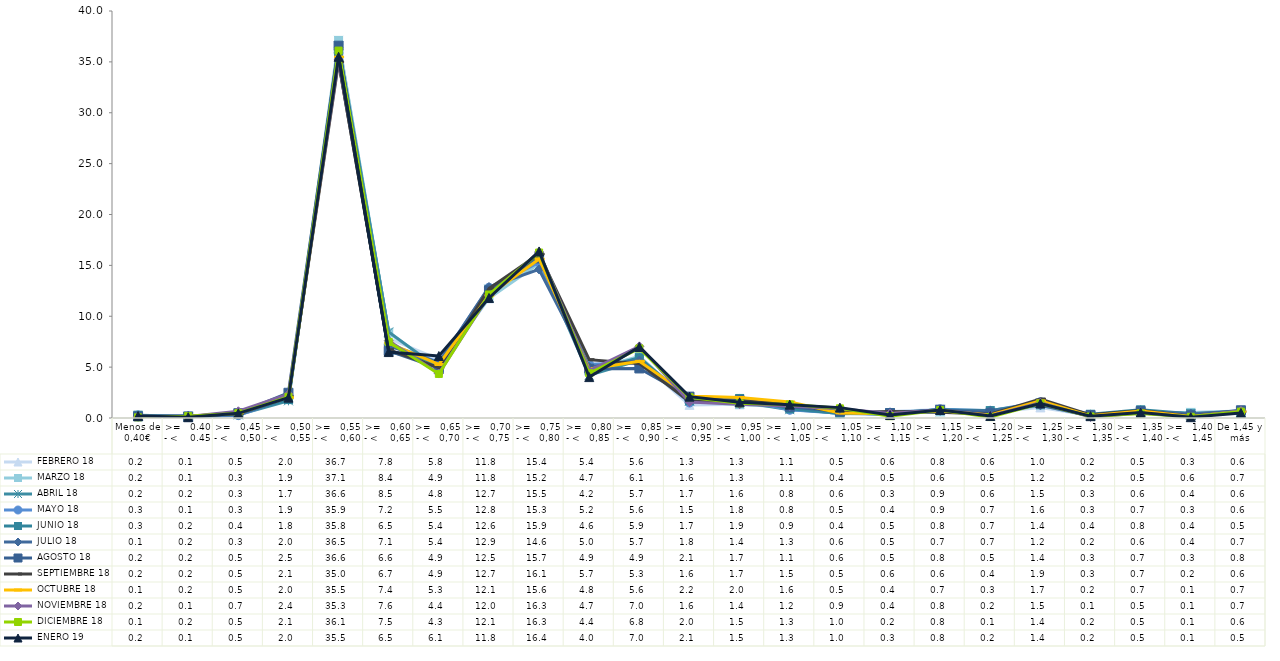
| Category |  FEBRERO 18 |  MARZO 18 |  ABRIL 18 |  MAYO 18 |  JUNIO 18 |  JULIO 18 |  AGOSTO 18 |  SEPTIEMBRE 18 |  OCTUBRE 18 |  NOVIEMBRE 18 |  DICIEMBRE 18 |  ENERO 19 |
|---|---|---|---|---|---|---|---|---|---|---|---|---|
| Menos de 0,40€ | 0.23 | 0.24 | 0.2 | 0.25 | 0.28 | 0.12 | 0.15 | 0.17 | 0.08 | 0.16 | 0.07 | 0.2 |
| >=   0.40 - <    0.45 | 0.08 | 0.1 | 0.16 | 0.11 | 0.17 | 0.22 | 0.15 | 0.15 | 0.15 | 0.14 | 0.18 | 0.08 |
| >=   0,45 - <    0,50 | 0.47 | 0.33 | 0.32 | 0.28 | 0.4 | 0.33 | 0.47 | 0.45 | 0.53 | 0.66 | 0.47 | 0.46 |
| >=   0,50 - <    0,55 | 1.95 | 1.9 | 1.69 | 1.94 | 1.81 | 2.02 | 2.48 | 2.09 | 2.02 | 2.35 | 2.08 | 2 |
| >=   0,55 - <    0,60 | 36.65 | 37.11 | 36.55 | 35.9 | 35.81 | 36.45 | 36.59 | 34.99 | 35.48 | 35.27 | 36.11 | 35.5 |
| >=   0,60 - <    0,65 | 7.82 | 8.37 | 8.46 | 7.24 | 6.54 | 7.09 | 6.6 | 6.71 | 7.36 | 7.6 | 7.48 | 6.48 |
| >=   0,65 - <   0,70 | 5.77 | 4.94 | 4.82 | 5.48 | 5.37 | 5.43 | 4.89 | 4.94 | 5.26 | 4.37 | 4.33 | 6.09 |
| >=   0,70 - <   0,75 | 11.76 | 11.77 | 12.66 | 12.8 | 12.63 | 12.87 | 12.53 | 12.72 | 12.06 | 12.03 | 12.14 | 11.8 |
| >=   0,75 - <   0,80 | 15.39 | 15.19 | 15.48 | 15.29 | 15.89 | 14.6 | 15.68 | 16.11 | 15.63 | 16.31 | 16.26 | 16.37 |
| >=   0,80 - <   0,85 | 5.36 | 4.73 | 4.21 | 5.24 | 4.61 | 5.02 | 4.85 | 5.73 | 4.81 | 4.65 | 4.4 | 4.02 |
| >=   0,85 - <   0,90 | 5.62 | 6.06 | 5.68 | 5.56 | 5.93 | 5.66 | 4.87 | 5.34 | 5.57 | 7.04 | 6.84 | 6.98 |
| >=   0,90 - <    0,95 | 1.29 | 1.62 | 1.67 | 1.52 | 1.71 | 1.79 | 2.1 | 1.62 | 2.15 | 1.56 | 2.04 | 2.1 |
| >=   0,95 - <   1,00 | 1.34 | 1.33 | 1.6 | 1.79 | 1.92 | 1.43 | 1.74 | 1.68 | 2.01 | 1.35 | 1.45 | 1.54 |
| >=   1,00 - <   1,05 | 1.06 | 1.09 | 0.82 | 0.81 | 0.91 | 1.3 | 1.1 | 1.47 | 1.58 | 1.18 | 1.33 | 1.31 |
| >=   1,05 - <    1,10 | 0.46 | 0.4 | 0.55 | 0.46 | 0.44 | 0.63 | 0.64 | 0.52 | 0.5 | 0.9 | 0.95 | 1.02 |
| >=   1,10 - <   1,15 | 0.64 | 0.52 | 0.34 | 0.35 | 0.54 | 0.45 | 0.48 | 0.64 | 0.42 | 0.44 | 0.18 | 0.29 |
| >=   1,15 - <    1,20 | 0.83 | 0.6 | 0.85 | 0.86 | 0.78 | 0.7 | 0.82 | 0.57 | 0.71 | 0.79 | 0.78 | 0.79 |
| >=   1,20 - <    1,25 | 0.57 | 0.45 | 0.55 | 0.71 | 0.73 | 0.69 | 0.46 | 0.38 | 0.3 | 0.23 | 0.09 | 0.2 |
| >=   1,25 - <    1,30 | 1.04 | 1.23 | 1.47 | 1.56 | 1.42 | 1.24 | 1.43 | 1.87 | 1.68 | 1.5 | 1.43 | 1.43 |
| >=   1,30 - <    1,35 | 0.24 | 0.21 | 0.26 | 0.28 | 0.37 | 0.2 | 0.28 | 0.31 | 0.21 | 0.1 | 0.15 | 0.18 |
| >=   1,35 - <    1,40 | 0.51 | 0.54 | 0.64 | 0.67 | 0.81 | 0.63 | 0.68 | 0.73 | 0.68 | 0.5 | 0.45 | 0.53 |
| >=   1,40 - <    1,45 | 0.32 | 0.55 | 0.42 | 0.31 | 0.42 | 0.43 | 0.25 | 0.18 | 0.14 | 0.11 | 0.12 | 0.08 |
| De 1,45 y más | 0.59 | 0.7 | 0.59 | 0.59 | 0.51 | 0.68 | 0.76 | 0.61 | 0.67 | 0.72 | 0.63 | 0.5 |